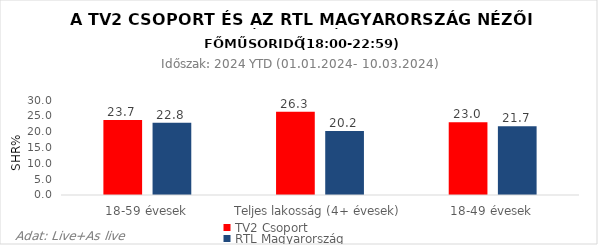
| Category | TV2 Csoport | RTL Magyarország |
|---|---|---|
| 18-59 évesek | 23.7 | 22.8 |
| Teljes lakosság (4+ évesek) | 26.3 | 20.2 |
| 18-49 évesek | 23 | 21.7 |